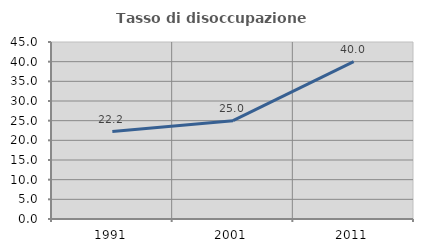
| Category | Tasso di disoccupazione giovanile  |
|---|---|
| 1991.0 | 22.222 |
| 2001.0 | 25 |
| 2011.0 | 40 |